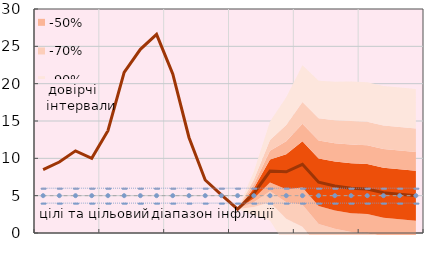
| Category | Series 8 | Series 10 | Series 11 | Series 12 |
|---|---|---|---|---|
|  | 8.5 | 4 | 5 | 6 |
|  | 9.5 | 4 | 5 | 6 |
|  | 11 | 4 | 5 | 6 |
| IV.21 | 10 | 4 | 5 | 6 |
|  | 13.7 | 4 | 5 | 6 |
|  | 21.5 | 4 | 5 | 6 |
|  | 24.6 | 4 | 5 | 6 |
| IV.22 | 26.6 | 4 | 5 | 6 |
|  | 21.3 | 4 | 5 | 6 |
|  | 12.8 | 4 | 5 | 6 |
|  | 7.1 | 4 | 5 | 6 |
| IV.23 | 5.1 | 4 | 5 | 6 |
|  | 3.2 | 4 | 5 | 6 |
|  | 5.3 | 4 | 5 | 6 |
|  | 8.3 | 4 | 5 | 6 |
| IV.24 | 8.2 | 4 | 5 | 6 |
|  | 9.2 | 4 | 5 | 6 |
|  | 6.8 | 4 | 5 | 6 |
|  | 6.3 | 4 | 5 | 6 |
| IV.25 | 6 | 4 | 5 | 6 |
|  | 5.9 | 4 | 5 | 6 |
|  | 5.4 | 4 | 5 | 6 |
|  | 5.2 | 4 | 5 | 6 |
| IV.26 | 5 | 4 | 5 | 6 |